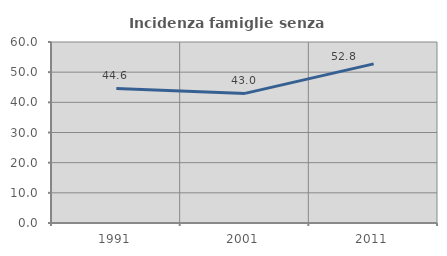
| Category | Incidenza famiglie senza nuclei |
|---|---|
| 1991.0 | 44.586 |
| 2001.0 | 42.963 |
| 2011.0 | 52.756 |